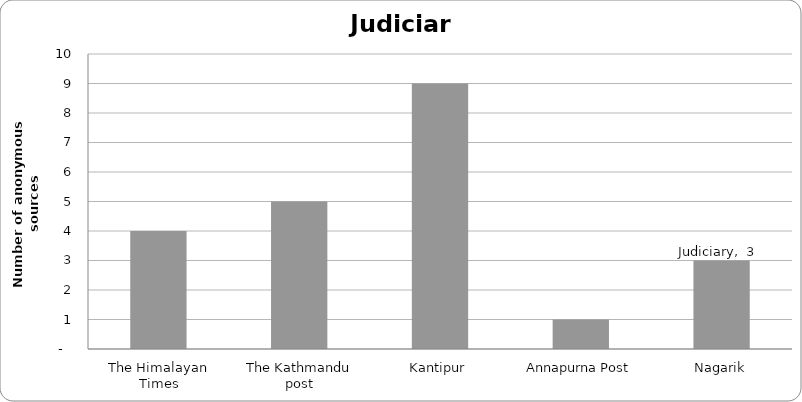
| Category | Judiciary |
|---|---|
| The Himalayan Times | 4 |
| The Kathmandu post | 5 |
| Kantipur | 9 |
| Annapurna Post | 1 |
| Nagarik | 3 |